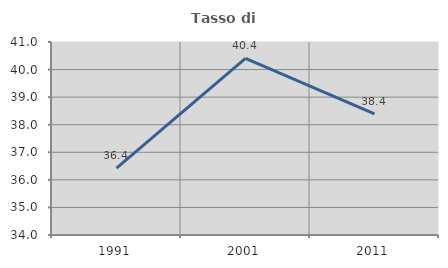
| Category | Tasso di occupazione   |
|---|---|
| 1991.0 | 36.423 |
| 2001.0 | 40.408 |
| 2011.0 | 38.394 |